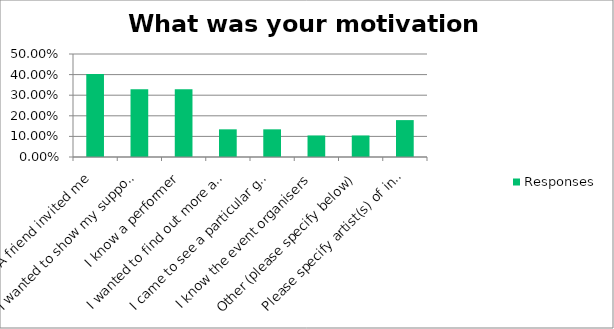
| Category | Responses |
|---|---|
| A friend invited me | 0.403 |
| I wanted to show my support | 0.328 |
| I know a performer | 0.328 |
| I wanted to find out more about Hull Dance | 0.134 |
| I came to see a particular group/performer | 0.134 |
| I know the event organisers | 0.104 |
| Other (please specify below) | 0.104 |
| Please specify artist(s) of interest OR other motivation below: | 0.179 |